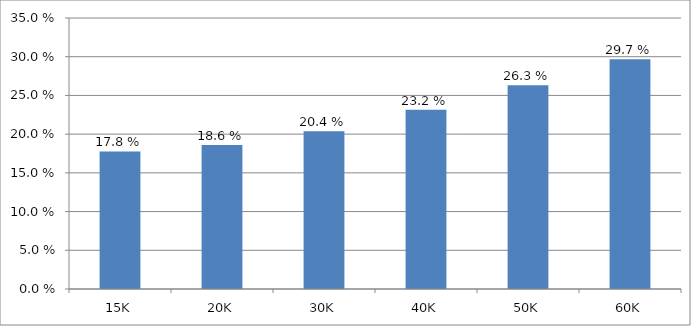
| Category | Series 0 |
|---|---|
| 15K | 0.178 |
| 20K | 0.186 |
| 30K | 0.204 |
| 40K | 0.232 |
| 50K | 0.263 |
| 60K | 0.297 |